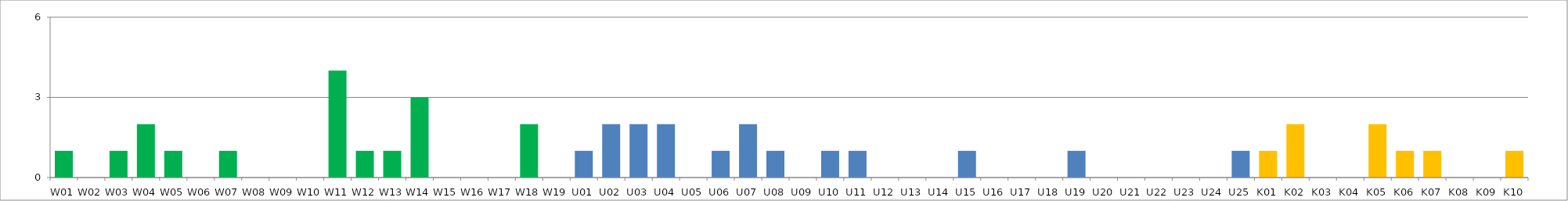
| Category | Series 0 |
|---|---|
| W01 | 1 |
| W02 | 0 |
| W03 | 1 |
| W04 | 2 |
| W05 | 1 |
| W06 | 0 |
| W07 | 1 |
| W08 | 0 |
| W09 | 0 |
| W10 | 0 |
| W11 | 4 |
| W12 | 1 |
| W13 | 1 |
| W14 | 3 |
| W15 | 0 |
| W16 | 0 |
| W17 | 0 |
| W18 | 2 |
| W19 | 0 |
| U01 | 1 |
| U02 | 2 |
| U03 | 2 |
| U04 | 2 |
| U05 | 0 |
| U06 | 1 |
| U07 | 2 |
| U08 | 1 |
| U09 | 0 |
| U10 | 1 |
| U11 | 1 |
| U12 | 0 |
| U13 | 0 |
| U14 | 0 |
| U15 | 1 |
| U16 | 0 |
| U17 | 0 |
| U18 | 0 |
| U19 | 1 |
| U20 | 0 |
| U21 | 0 |
| U22 | 0 |
| U23 | 0 |
| U24 | 0 |
| U25 | 1 |
| K01 | 1 |
| K02 | 2 |
| K03 | 0 |
| K04 | 0 |
| K05 | 2 |
| K06 | 1 |
| K07 | 1 |
| K08 | 0 |
| K09 | 0 |
| K10 | 1 |